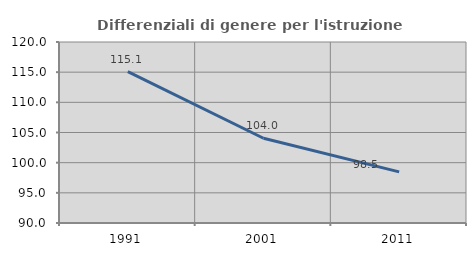
| Category | Differenziali di genere per l'istruzione superiore |
|---|---|
| 1991.0 | 115.101 |
| 2001.0 | 104.05 |
| 2011.0 | 98.477 |